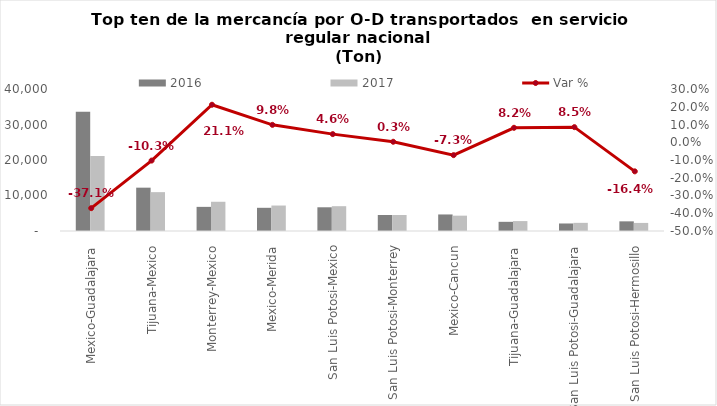
| Category | 2016 | 2017 |
|---|---|---|
| Mexico-Guadalajara | 33609.871 | 21127.598 |
| Tijuana-Mexico | 12206.288 | 10945.538 |
| Monterrey-Mexico | 6798.13 | 8234.836 |
| Mexico-Merida | 6533.546 | 7173.928 |
| San Luis Potosi-Mexico | 6681.062 | 6987.13 |
| San Luis Potosi-Monterrey | 4501.443 | 4513.863 |
| Mexico-Cancun | 4659.72 | 4321.38 |
| Tijuana-Guadalajara | 2585.645 | 2796.431 |
| San Luis Potosi-Guadalajara | 2118.268 | 2298.572 |
| San Luis Potosi-Hermosillo | 2719.983 | 2274.119 |